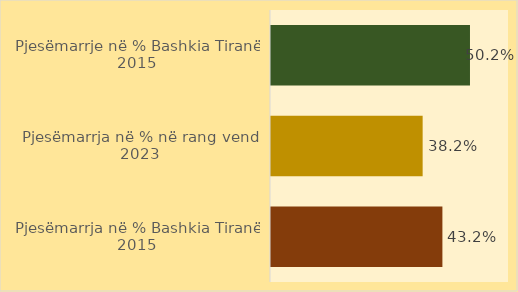
| Category | Series 0 |
|---|---|
| Pjesëmarrja në % Bashkia Tiranë 2015 | 0.432 |
| Pjesëmarrja në % në rang vendi 2023 | 0.382 |
| Pjesëmarrje në % Bashkia Tiranë 2015 | 0.502 |